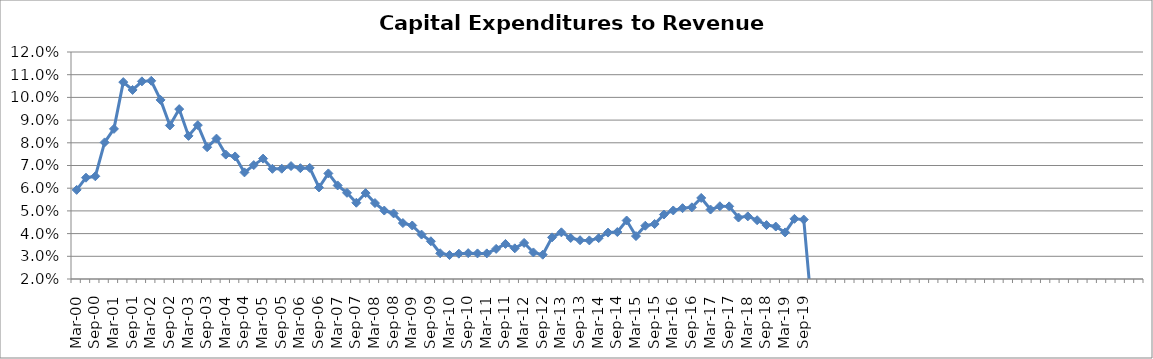
| Category | Series 0 |
|---|---|
| Mar-00 | 0.059 |
| Jun-00 | 0.065 |
| Sep-00 | 0.065 |
| Dec-00 | 0.08 |
| Mar-01 | 0.086 |
| Jun-01 | 0.107 |
| Sep-01 | 0.103 |
| Dec-01 | 0.107 |
| Mar-02 | 0.107 |
| Jun-02 | 0.099 |
| Sep-02 | 0.088 |
| Dec-02 | 0.095 |
| Mar-03 | 0.083 |
| Jun-03 | 0.088 |
| Sep-03 | 0.078 |
| Dec-03 | 0.082 |
| Mar-04 | 0.075 |
| Jun-04 | 0.074 |
| Sep-04 | 0.067 |
| Dec-04 | 0.07 |
| Mar-05 | 0.073 |
| Jun-05 | 0.069 |
| Sep-05 | 0.069 |
| Dec-05 | 0.07 |
| Mar-06 | 0.069 |
| Jun-06 | 0.069 |
| Sep-06 | 0.06 |
| Dec-06 | 0.067 |
| Mar-07 | 0.061 |
| Jun-07 | 0.058 |
| Sep-07 | 0.054 |
| Dec-07 | 0.058 |
| Mar-08 | 0.053 |
| Jun-08 | 0.05 |
| Sep-08 | 0.049 |
| Dec-08 | 0.045 |
| Mar-09 | 0.044 |
| Jun-09 | 0.04 |
| Sep-09 | 0.037 |
| Dec-09 | 0.031 |
| Mar-10 | 0.031 |
| Jun-10 | 0.031 |
| Sep-10 | 0.031 |
| Dec-10 | 0.031 |
| Mar-11 | 0.031 |
| Jun-11 | 0.033 |
| Sep-11 | 0.035 |
| Dec-11 | 0.034 |
| Mar-12 | 0.036 |
| Jun-12 | 0.032 |
| Sep-12 | 0.031 |
| Dec-12 | 0.038 |
| Mar-13 | 0.041 |
| Jun-13 | 0.038 |
| Sep-13 | 0.037 |
| Dec-13 | 0.037 |
| Mar-14 | 0.038 |
| Jun-14 | 0.04 |
| Sep-14 | 0.041 |
| Dec-14 | 0.046 |
| Mar-15 | 0.039 |
| Jun-15 | 0.043 |
| Sep-15 | 0.044 |
| Dec-15 | 0.048 |
| Mar-16 | 0.05 |
| Jun-16 | 0.051 |
| Sep-16 | 0.052 |
| Dec-16 | 0.056 |
| Mar-17 | 0.051 |
| Jun-17 | 0.052 |
| Sep-17 | 0.052 |
| Dec-17 | 0.047 |
| Mar-18 | 0.048 |
| Jun-18 | 0.046 |
| Sep-18 | 0.044 |
| Dec-18 | 0.043 |
| Mar-19 | 0.041 |
| Jun-19 | 0.047 |
| Sep-19 | 0.046 |